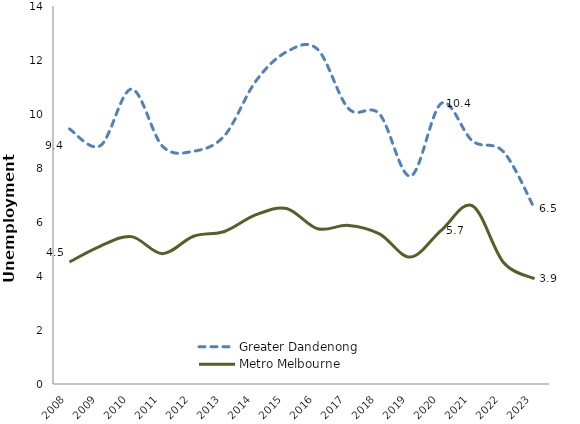
| Category | Greater Dandenong  | Metro Melbourne |
|---|---|---|
| 2008.0 | 9.446 | 4.52 |
| 2009.0 | 8.83 | 5.109 |
| 2010.0 | 10.923 | 5.459 |
| 2011.0 | 8.807 | 4.827 |
| 2012.0 | 8.621 | 5.471 |
| 2013.0 | 9.197 | 5.647 |
| 2014.0 | 11.2 | 6.261 |
| 2015.0 | 12.3 | 6.5 |
| 2016.0 | 12.4 | 5.752 |
| 2017.0 | 10.2 | 5.874 |
| 2018.0 | 10 | 5.561 |
| 2019.0 | 7.7 | 4.7 |
| 2020.0 | 10.4 | 5.7 |
| 2021.0 | 9 | 6.6 |
| 2022.0 | 8.6 | 4.5 |
| 2023.0 | 6.5 | 3.9 |